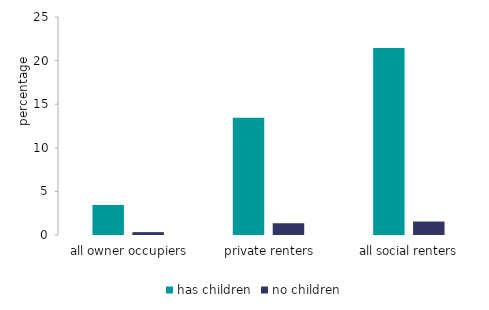
| Category | has children | no children |
|---|---|---|
| 0 | 3.445 | 0.332 |
| 1 | 13.453 | 1.336 |
| 2 | 21.443 | 1.547 |